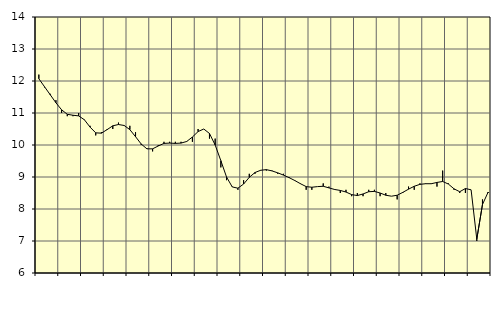
| Category | Piggar | Tillverkning av verkstadsvaror, SNI 25-30, 33 |
|---|---|---|
| nan | 12.2 | 12.07 |
| 1.0 | 11.8 | 11.82 |
| 1.0 | 11.6 | 11.57 |
| 1.0 | 11.4 | 11.32 |
| nan | 11 | 11.1 |
| 2.0 | 10.9 | 10.96 |
| 2.0 | 10.9 | 10.93 |
| 2.0 | 11 | 10.91 |
| nan | 10.8 | 10.79 |
| 3.0 | 10.6 | 10.56 |
| 3.0 | 10.3 | 10.38 |
| 3.0 | 10.4 | 10.37 |
| nan | 10.5 | 10.48 |
| 4.0 | 10.5 | 10.6 |
| 4.0 | 10.7 | 10.64 |
| 4.0 | 10.6 | 10.61 |
| nan | 10.6 | 10.48 |
| 5.0 | 10.4 | 10.26 |
| 5.0 | 10 | 10.03 |
| 5.0 | 9.9 | 9.88 |
| nan | 9.8 | 9.88 |
| 6.0 | 10 | 9.97 |
| 6.0 | 10.1 | 10.05 |
| 6.0 | 10.1 | 10.06 |
| nan | 10.1 | 10.05 |
| 7.0 | 10.1 | 10.06 |
| 7.0 | 10.1 | 10.11 |
| 7.0 | 10.1 | 10.25 |
| nan | 10.5 | 10.42 |
| 8.0 | 10.5 | 10.5 |
| 8.0 | 10.2 | 10.36 |
| 8.0 | 10.2 | 10 |
| nan | 9.3 | 9.51 |
| 9.0 | 8.9 | 9 |
| 9.0 | 8.7 | 8.69 |
| 9.0 | 8.6 | 8.65 |
| nan | 8.9 | 8.78 |
| 10.0 | 9.1 | 8.99 |
| 10.0 | 9.1 | 9.14 |
| 10.0 | 9.2 | 9.21 |
| nan | 9.2 | 9.23 |
| 11.0 | 9.2 | 9.19 |
| 11.0 | 9.1 | 9.13 |
| 11.0 | 9.1 | 9.06 |
| nan | 9 | 8.98 |
| 12.0 | 8.9 | 8.89 |
| 12.0 | 8.8 | 8.79 |
| 12.0 | 8.6 | 8.7 |
| nan | 8.6 | 8.68 |
| 13.0 | 8.7 | 8.7 |
| 13.0 | 8.8 | 8.71 |
| 13.0 | 8.7 | 8.66 |
| nan | 8.6 | 8.61 |
| 14.0 | 8.5 | 8.58 |
| 14.0 | 8.6 | 8.53 |
| 14.0 | 8.4 | 8.45 |
| nan | 8.5 | 8.42 |
| 15.0 | 8.4 | 8.47 |
| 15.0 | 8.6 | 8.54 |
| 15.0 | 8.6 | 8.55 |
| nan | 8.4 | 8.5 |
| 16.0 | 8.5 | 8.43 |
| 16.0 | 8.4 | 8.4 |
| 16.0 | 8.3 | 8.43 |
| nan | 8.5 | 8.52 |
| 17.0 | 8.7 | 8.62 |
| 17.0 | 8.6 | 8.71 |
| 17.0 | 8.8 | 8.77 |
| nan | 8.8 | 8.79 |
| 18.0 | 8.8 | 8.79 |
| 18.0 | 8.7 | 8.83 |
| 18.0 | 9.2 | 8.86 |
| nan | 8.8 | 8.78 |
| 19.0 | 8.6 | 8.63 |
| 19.0 | 8.5 | 8.54 |
| 19.0 | 8.5 | 8.64 |
| nan | 8.6 | 8.6 |
| 20.0 | 7 | 7.06 |
| 20.0 | 8.3 | 8.14 |
| 20.0 | 8.5 | 8.53 |